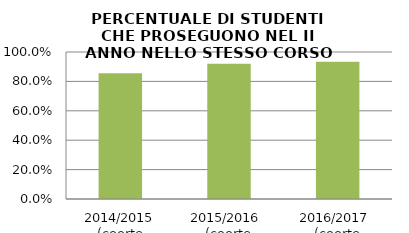
| Category | 2014/2015 (coorte 2013/14) 2015/2016  (coorte 2014/15) 2016/2017  (coorte 2015/16) |
|---|---|
| 2014/2015 (coorte 2013/14) | 0.855 |
| 2015/2016  (coorte 2014/15) | 0.92 |
| 2016/2017  (coorte 2015/16) | 0.933 |